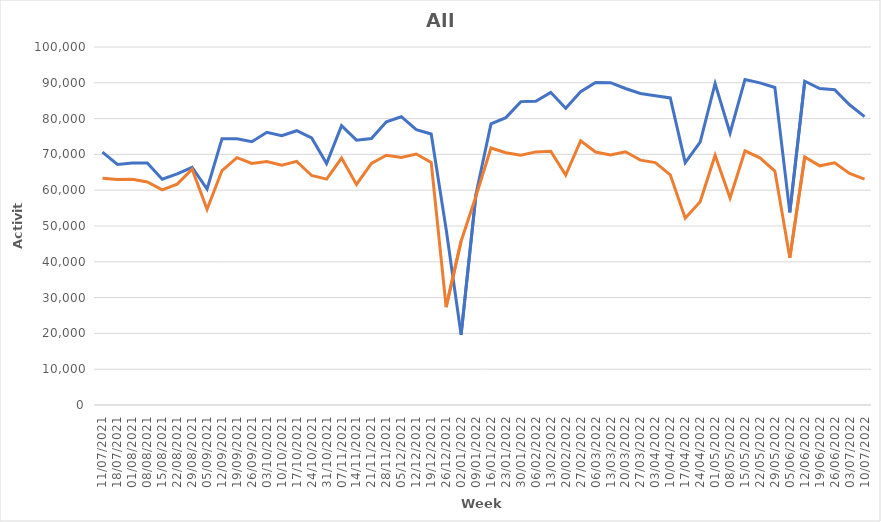
| Category | 2021-2022 | 2019-2020 |
|---|---|---|
| 11/07/2021 | 70641 | 63353 |
| 18/07/2021 | 67189 | 63011 |
| 01/08/2021 | 67595 | 63073 |
| 08/08/2021 | 67592 | 62286 |
| 15/08/2021 | 63063 | 60087 |
| 22/08/2021 | 64534 | 61686 |
| 29/08/2021 | 66405 | 65876.25 |
| 05/09/2021 | 60337 | 54685.6 |
| 12/09/2021 | 74396 | 65480 |
| 19/09/2021 | 74374 | 69097 |
| 26/09/2021 | 73535 | 67484 |
| 03/10/2021 | 76191 | 68015 |
| 10/10/2021 | 75234 | 66961 |
| 17/10/2021 | 76615 | 68067 |
| 24/10/2021 | 74592 | 64115 |
| 31/10/2021 | 67457 | 63089 |
| 07/11/2021 | 78032 | 68977 |
| 14/11/2021 | 73975 | 61605 |
| 21/11/2021 | 74425 | 67510 |
| 28/11/2021 | 79127 | 69758 |
| 05/12/2021 | 80529 | 69158 |
| 12/12/2021 | 76900 | 70112 |
| 19/12/2021 | 75702 | 67783 |
| 26/12/2021 | 49081 | 27335 |
| 02/01/2022 | 19617 | 45763.5 |
| 09/01/2022 | 58975 | 58384.8 |
| 16/01/2022 | 78538 | 71795 |
| 23/01/2022 | 80268 | 70457 |
| 30/01/2022 | 84743 | 69798 |
| 06/02/2022 | 84830 | 70696 |
| 13/02/2022 | 87334 | 70875 |
| 20/02/2022 | 82913 | 64249 |
| 27/02/2022 | 87504 | 73777 |
| 06/03/2022 | 90115 | 70658 |
| 13/03/2022 | 90045 | 69830 |
| 20/03/2022 | 88404 | 70750 |
| 27/03/2022 | 87005 | 68399 |
| 03/04/2022 | 86376 | 67712 |
| 10/04/2022 | 85770 | 64281 |
| 17/04/2022 | 67701 | 52190 |
| 24/04/2022 | 73406 | 56790 |
| 01/05/2022 | 89770 | 69765 |
| 08/05/2022 | 75970 | 57835 |
| 15/05/2022 | 90944 | 71009 |
| 22/05/2022 | 89982 | 69045 |
| 29/05/2022 | 88693 | 65335 |
| 05/06/2022 | 53821 | 41124.6 |
| 12/06/2022 | 90445 | 69280 |
| 19/06/2022 | 88377 | 66809 |
| 26/06/2022 | 88082 | 67642 |
| 03/07/2022 | 83860 | 64681 |
| 10/07/2022 | 80544 | 63114 |